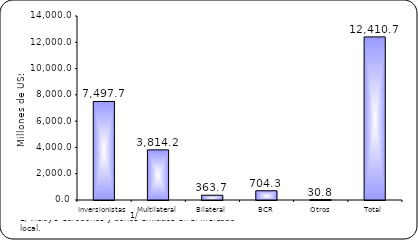
| Category | Series 1 |
|---|---|
| Inversionistas | 7497.7 |
| Multilateral | 3814.2 |
| Bilateral | 363.7 |
| BCR | 704.3 |
| Otros | 30.8 |
| Total | 12410.7 |